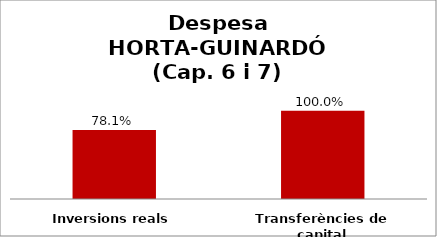
| Category | Series 0 |
|---|---|
| Inversions reals | 0.781 |
| Transferències de capital | 1 |